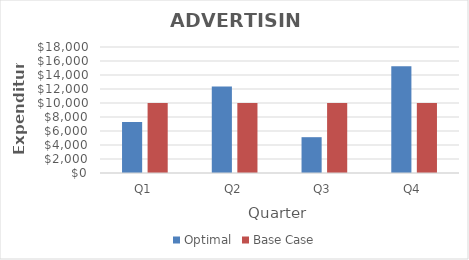
| Category | Optimal | Base Case |
|---|---|---|
| Q1 | 7273.171 | 10000 |
| Q2 | 12346.341 | 10000 |
| Q3 | 5117.073 | 10000 |
| Q4 | 15263.415 | 10000 |